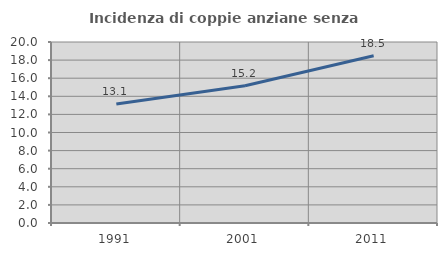
| Category | Incidenza di coppie anziane senza figli  |
|---|---|
| 1991.0 | 13.149 |
| 2001.0 | 15.168 |
| 2011.0 | 18.476 |